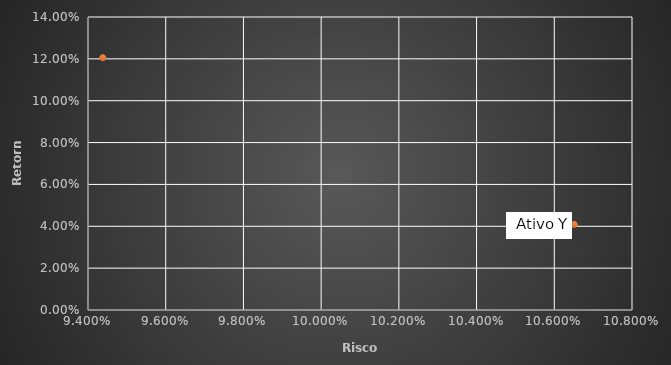
| Category | Series 0 |
|---|---|
| 0.09438029455347127 | 0.121 |
| 0.10651380192256776 | 0.041 |